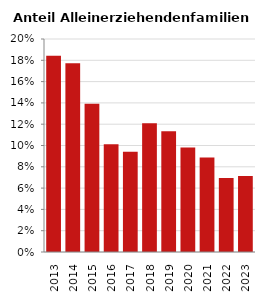
| Category | Anteil Alleinerziehende an Familien |
|---|---|
| 2013.0 | 0.184 |
| 2014.0 | 0.177 |
| 2015.0 | 0.139 |
| 2016.0 | 0.101 |
| 2017.0 | 0.094 |
| 2018.0 | 0.121 |
| 2019.0 | 0.113 |
| 2020.0 | 0.098 |
| 2021.0 | 0.089 |
| 2022.0 | 0.07 |
| 2023.0 | 0.071 |